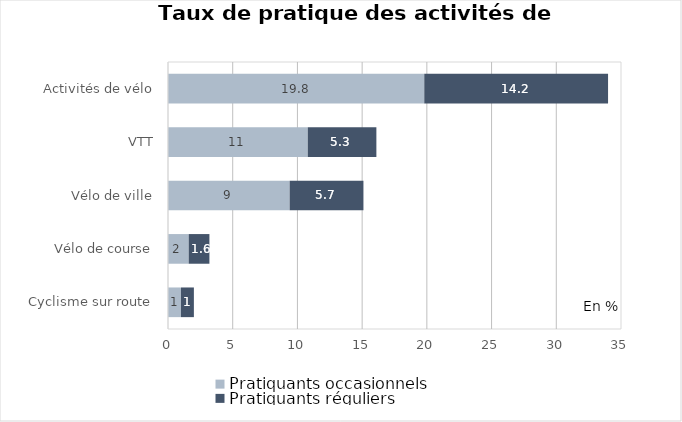
| Category | Pratiquants occasionnels | Pratiquants réguliers |
|---|---|---|
| Cyclisme sur route | 1 | 1 |
| Vélo de course | 1.6 | 1.6 |
| Vélo de ville | 9.4 | 5.7 |
| VTT | 10.8 | 5.3 |
| Activités de vélo | 19.8 | 14.2 |